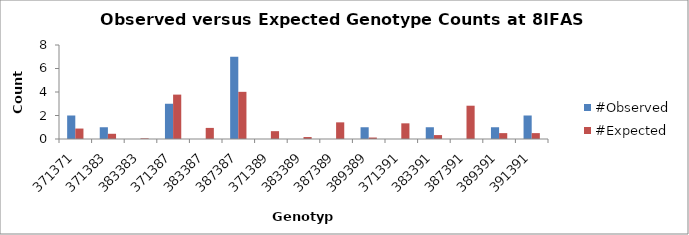
| Category | #Observed | #Expected |
|---|---|---|
| 371371.0 | 2 | 0.889 |
| 371383.0 | 1 | 0.444 |
| 383383.0 | 0 | 0.056 |
| 371387.0 | 3 | 3.778 |
| 383387.0 | 0 | 0.944 |
| 387387.0 | 7 | 4.014 |
| 371389.0 | 0 | 0.667 |
| 383389.0 | 0 | 0.167 |
| 387389.0 | 0 | 1.417 |
| 389389.0 | 1 | 0.125 |
| 371391.0 | 0 | 1.333 |
| 383391.0 | 1 | 0.333 |
| 387391.0 | 0 | 2.833 |
| 389391.0 | 1 | 0.5 |
| 391391.0 | 2 | 0.5 |